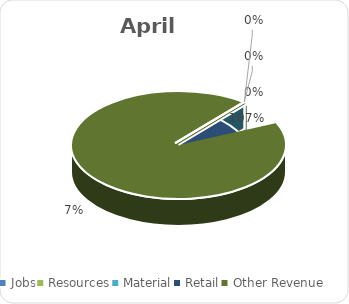
| Category | April |
|---|---|
| Jobs | 0 |
| Resources | 0 |
| Material | 0 |
| Retail | 524825.5 |
| Other Revenue | -35167.82 |